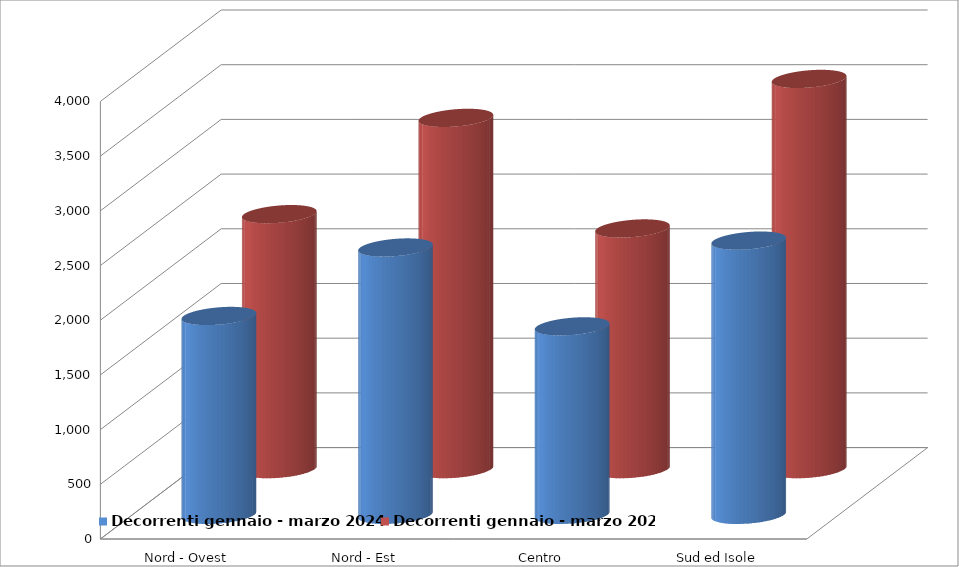
| Category | Decorrenti gennaio - marzo 2024 | Decorrenti gennaio - marzo 2023 |
|---|---|---|
| Nord - Ovest | 1818 | 2331 |
| Nord - Est | 2444 | 3211 |
| Centro | 1723 | 2200 |
| Sud ed Isole | 2507 | 3567 |